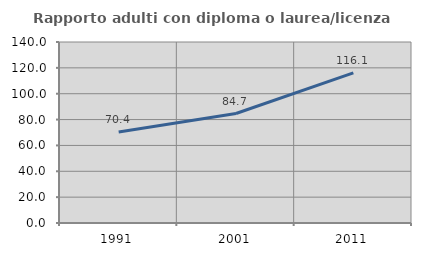
| Category | Rapporto adulti con diploma o laurea/licenza media  |
|---|---|
| 1991.0 | 70.37 |
| 2001.0 | 84.666 |
| 2011.0 | 116.14 |